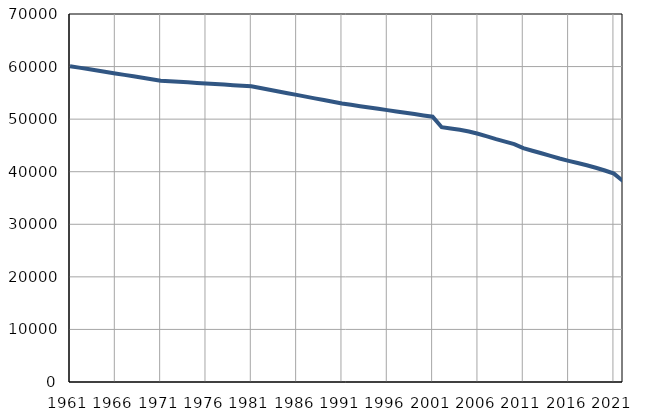
| Category | Број
становника |
|---|---|
| 1961.0 | 60075 |
| 1962.0 | 59799 |
| 1963.0 | 59523 |
| 1964.0 | 59247 |
| 1965.0 | 58971 |
| 1966.0 | 58695 |
| 1967.0 | 58419 |
| 1968.0 | 58143 |
| 1969.0 | 57867 |
| 1970.0 | 57591 |
| 1971.0 | 57315 |
| 1972.0 | 57209 |
| 1973.0 | 57103 |
| 1974.0 | 56997 |
| 1975.0 | 56891 |
| 1976.0 | 56786 |
| 1977.0 | 56680 |
| 1978.0 | 56574 |
| 1979.0 | 56467 |
| 1980.0 | 56362 |
| 1981.0 | 56256 |
| 1982.0 | 55927 |
| 1983.0 | 55599 |
| 1984.0 | 55270 |
| 1985.0 | 54941 |
| 1986.0 | 54613 |
| 1987.0 | 54284 |
| 1988.0 | 53955 |
| 1989.0 | 53626 |
| 1990.0 | 53297 |
| 1991.0 | 52969 |
| 1992.0 | 52718 |
| 1993.0 | 52467 |
| 1994.0 | 52215 |
| 1995.0 | 51964 |
| 1996.0 | 51713 |
| 1997.0 | 51461 |
| 1998.0 | 51210 |
| 1999.0 | 50959 |
| 2000.0 | 50707 |
| 2001.0 | 50456 |
| 2002.0 | 48459 |
| 2003.0 | 48213 |
| 2004.0 | 47995 |
| 2005.0 | 47653 |
| 2006.0 | 47227 |
| 2007.0 | 46729 |
| 2008.0 | 46201 |
| 2009.0 | 45725 |
| 2010.0 | 45261 |
| 2011.0 | 44479 |
| 2012.0 | 43986 |
| 2013.0 | 43511 |
| 2014.0 | 43021 |
| 2015.0 | 42515 |
| 2016.0 | 42068 |
| 2017.0 | 41652 |
| 2018.0 | 41218 |
| 2019.0 | 40748 |
| 2020.0 | 40229 |
| 2021.0 | 39643 |
| 2022.0 | 38224 |